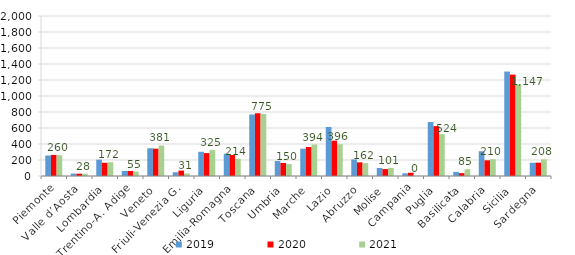
| Category | 2019 | 2020 | 2021 |
|---|---|---|---|
| Piemonte | 256 | 263.19 | 260.184 |
| Valle d’Aosta | 30 | 29.023 | 28.337 |
| Lombardia | 204 | 165.096 | 172.481 |
| Trentino-A. Adige | 63 | 63.226 | 54.974 |
| Veneto | 347 | 341.511 | 381.263 |
| Friuli-Venezia G. | 47 | 67.859 | 31.278 |
| Liguria | 303 | 286.262 | 325.225 |
| Emilia-Romagna | 278 | 262.693 | 214.205 |
| Toscana | 769 | 784.46 | 774.908 |
| Umbria | 187 | 162.466 | 149.516 |
| Marche | 341 | 362.544 | 393.658 |
| Lazio | 613 | 441.699 | 396.212 |
| Abruzzo | 207 | 170.913 | 161.662 |
| Molise | 100 | 86.577 | 101.381 |
| Campania | 33 | 40.537 | 0 |
| Puglia | 675 | 623.239 | 523.936 |
| Basilicata | 51 | 35.79 | 85.013 |
| Calabria | 309 | 196.169 | 209.646 |
| Sicilia | 1306 | 1267.613 | 1146.712 |
| Sardegna | 165 | 166.261 | 208.049 |